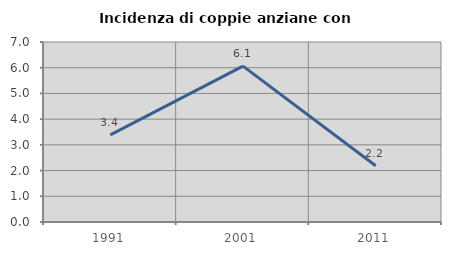
| Category | Incidenza di coppie anziane con figli |
|---|---|
| 1991.0 | 3.39 |
| 2001.0 | 6.061 |
| 2011.0 | 2.19 |